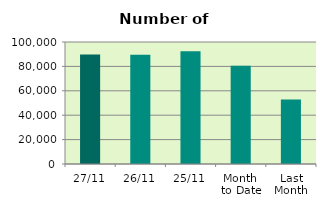
| Category | Series 0 |
|---|---|
| 27/11 | 89854 |
| 26/11 | 89640 |
| 25/11 | 92376 |
| Month 
to Date | 80520.3 |
| Last
Month | 52845 |